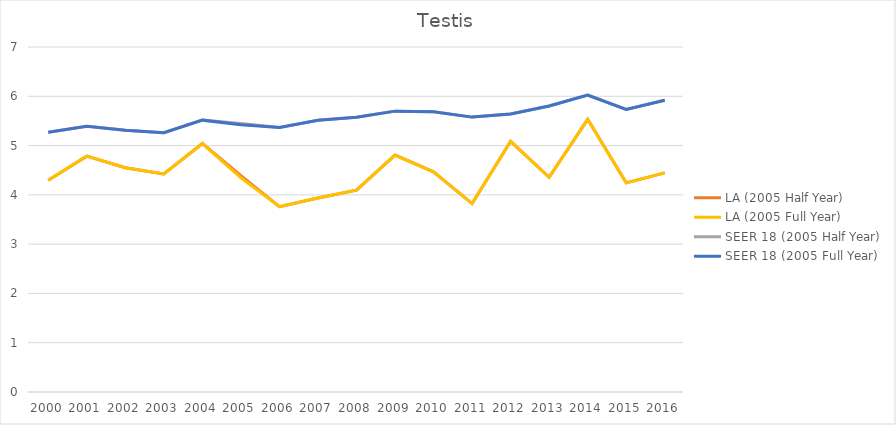
| Category | LA (2005 Half Year) | LA (2005 Full Year) | SEER 18 (2005 Half Year) | SEER 18 (2005 Full Year) |
|---|---|---|---|---|
| 2000.0 | 4.296 | 4.296 | 5.271 | 5.271 |
| 2001.0 | 4.786 | 4.786 | 5.39 | 5.39 |
| 2002.0 | 4.552 | 4.552 | 5.312 | 5.312 |
| 2003.0 | 4.426 | 4.426 | 5.261 | 5.261 |
| 2004.0 | 5.042 | 5.042 | 5.516 | 5.516 |
| 2005.0 | 4.389 | 4.347 | 5.45 | 5.421 |
| 2006.0 | 3.76 | 3.76 | 5.368 | 5.368 |
| 2007.0 | 3.937 | 3.937 | 5.512 | 5.512 |
| 2008.0 | 4.095 | 4.095 | 5.575 | 5.575 |
| 2009.0 | 4.808 | 4.808 | 5.699 | 5.699 |
| 2010.0 | 4.466 | 4.466 | 5.685 | 5.685 |
| 2011.0 | 3.824 | 3.824 | 5.577 | 5.577 |
| 2012.0 | 5.086 | 5.086 | 5.64 | 5.64 |
| 2013.0 | 4.356 | 4.356 | 5.803 | 5.803 |
| 2014.0 | 5.532 | 5.532 | 6.025 | 6.025 |
| 2015.0 | 4.244 | 4.244 | 5.731 | 5.731 |
| 2016.0 | 4.447 | 4.447 | 5.92 | 5.92 |